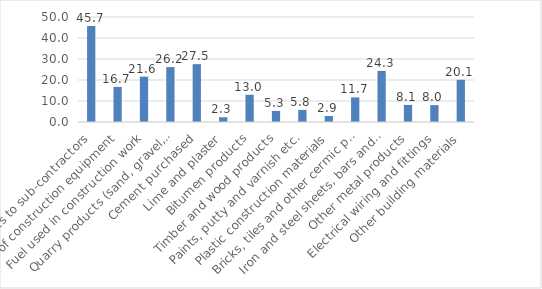
| Category | Frw Billion |
|---|---|
| Payments to sub-contractors | 45.673 |
| Hire of construction equipment | 16.716 |
| Fuel used in construction work | 21.613 |
| Quarry products (sand, gravel, stone etc) | 26.15 |
| Cement purchased | 27.55 |
| Lime and plaster | 2.253 |
| Bitumen products | 12.957 |
| Timber and wood products | 5.265 |
| Paints, putty and varnish etc. | 5.761 |
| Plastic construction materials | 2.855 |
| Bricks, tiles and other cermic products | 11.729 |
| Iron and steel sheets, bars and rods | 24.335 |
| Other metal products | 8.133 |
| Electrical wiring and fittings | 8.048 |
| Other building materials | 20.107 |